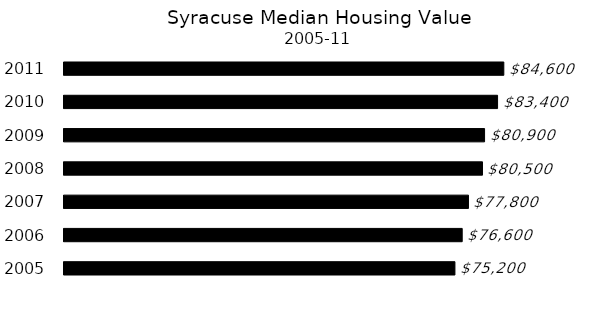
| Category | Series 0 |
|---|---|
| 2005 | 75200 |
| 2006 | 76600 |
| 2007 | 77800 |
| 2008 | 80500 |
| 2009 | 80900 |
| 2010 | 83400 |
| 2011 | 84600 |